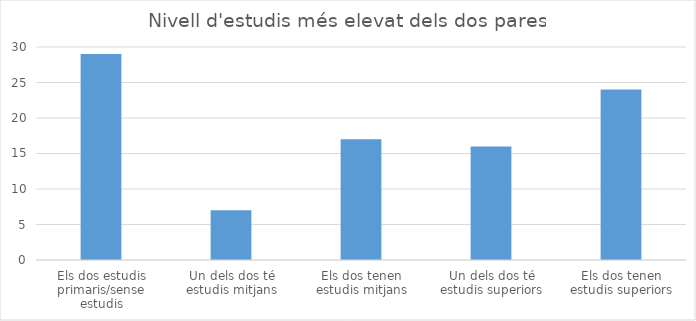
| Category | Series 0 |
|---|---|
| Els dos estudis primaris/sense estudis | 29 |
| Un dels dos té estudis mitjans | 7 |
| Els dos tenen estudis mitjans | 17 |
| Un dels dos té estudis superiors | 16 |
| Els dos tenen estudis superiors | 24 |